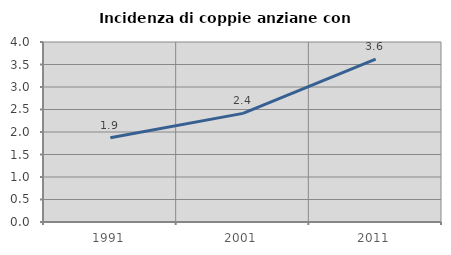
| Category | Incidenza di coppie anziane con figli |
|---|---|
| 1991.0 | 1.872 |
| 2001.0 | 2.414 |
| 2011.0 | 3.619 |